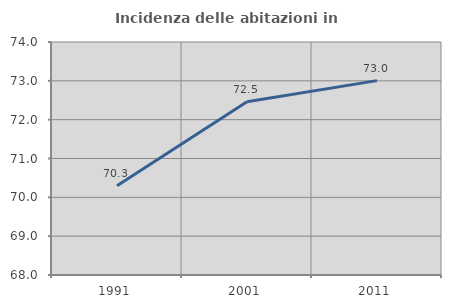
| Category | Incidenza delle abitazioni in proprietà  |
|---|---|
| 1991.0 | 70.296 |
| 2001.0 | 72.46 |
| 2011.0 | 73.005 |